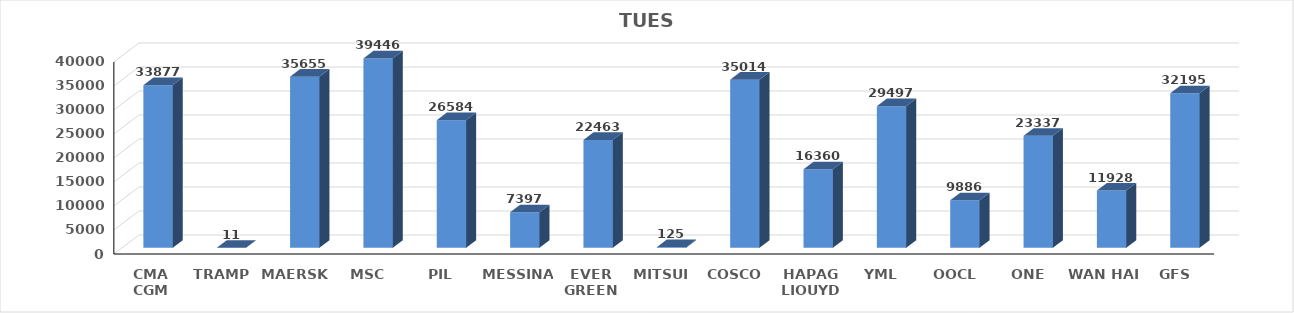
| Category | Series 0 |
|---|---|
| CMA CGM | 33877 |
| TRAMP | 11 |
| MAERSK | 35655 |
| MSC | 39446 |
| PIL | 26584 |
| MESSINA | 7397 |
| EVER GREEN | 22463 |
| MITSUI | 125 |
| COSCO | 35014 |
| HAPAG LIOUYD | 16360 |
| YML | 29497 |
| OOCL | 9886 |
| ONE | 23337 |
| WAN HAI | 11928 |
| GFS | 32195 |